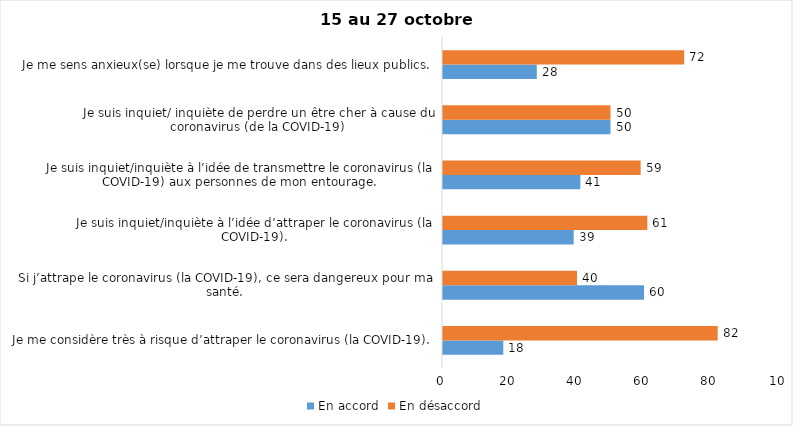
| Category | En accord | En désaccord |
|---|---|---|
| Je me considère très à risque d’attraper le coronavirus (la COVID-19). | 18 | 82 |
| Si j’attrape le coronavirus (la COVID-19), ce sera dangereux pour ma santé. | 60 | 40 |
| Je suis inquiet/inquiète à l’idée d’attraper le coronavirus (la COVID-19). | 39 | 61 |
| Je suis inquiet/inquiète à l’idée de transmettre le coronavirus (la COVID-19) aux personnes de mon entourage. | 41 | 59 |
| Je suis inquiet/ inquiète de perdre un être cher à cause du coronavirus (de la COVID-19) | 50 | 50 |
| Je me sens anxieux(se) lorsque je me trouve dans des lieux publics. | 28 | 72 |